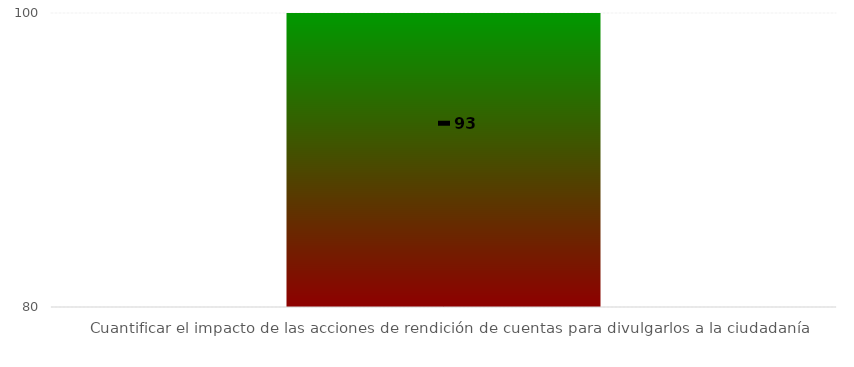
| Category | Rangos |
|---|---|
| Cuantificar el impacto de las acciones de rendición de cuentas para divulgarlos a la ciudadanía | 100 |